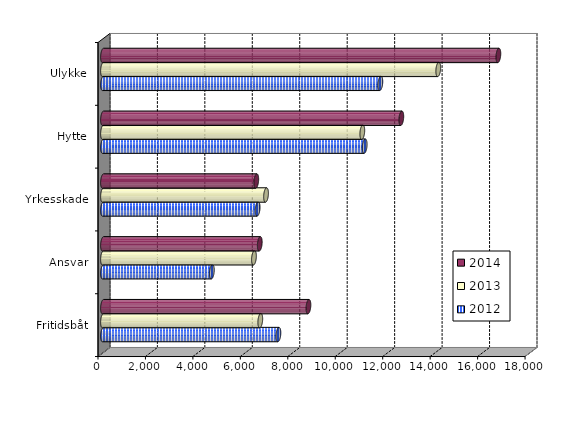
| Category | 2012 | 2013 | 2014 |
|---|---|---|---|
| Fritidsbåt | 7393.622 | 6629 | 8659 |
| Ansvar | 4587.775 | 6362.95 | 6607 |
| Yrkesskade | 6517.332 | 6871.8 | 6460 |
| Hytte | 11029.274 | 10929 | 12573 |
| Ulykke | 11689.759 | 14130.29 | 16664 |